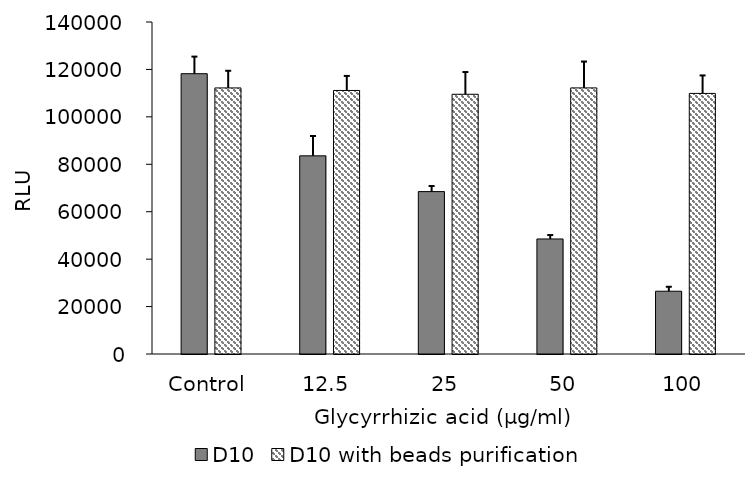
| Category | D10 | D10 with beads purification |
|---|---|---|
| Control | 118200.667 | 112199 |
| 12.5 | 83561.667 | 111133.333 |
| 25 | 68479 | 109523 |
| 50 | 48511 | 112212.667 |
| 100 | 26470.667 | 109887.667 |